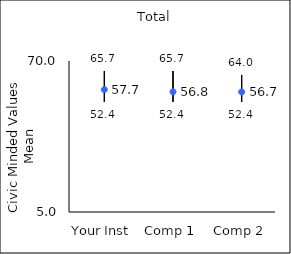
| Category | 25th percentile | 75th percentile | Mean |
|---|---|---|---|
| Your Inst | 52.4 | 65.7 | 57.68 |
| Comp 1 | 52.4 | 65.7 | 56.77 |
| Comp 2 | 52.4 | 64 | 56.7 |